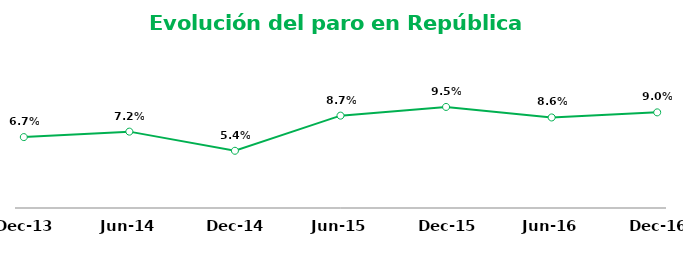
| Category | España |
|---|---|
| 2013-12-01 | 0.067 |
| 2014-06-01 | 0.072 |
| 2014-12-01 | 0.054 |
| 2015-06-01 | 0.087 |
| 2015-12-01 | 0.095 |
| 2016-06-01 | 0.086 |
| 2016-12-01 | 0.09 |